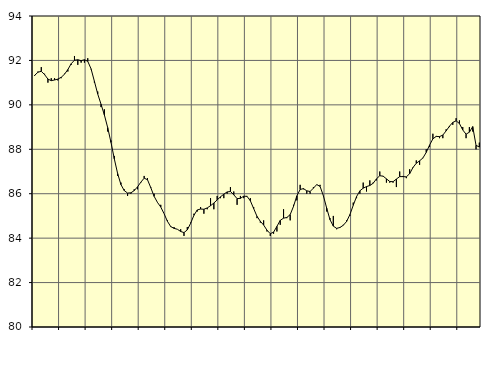
| Category | Piggar | Series 1 |
|---|---|---|
| nan | 91.3 | 91.33 |
| 87.0 | 91.5 | 91.47 |
| 87.0 | 91.7 | 91.51 |
| 87.0 | 91.4 | 91.36 |
| nan | 91 | 91.16 |
| 88.0 | 91.2 | 91.09 |
| 88.0 | 91.2 | 91.12 |
| 88.0 | 91.1 | 91.16 |
| nan | 91.2 | 91.24 |
| 89.0 | 91.4 | 91.38 |
| 89.0 | 91.5 | 91.59 |
| 89.0 | 91.8 | 91.85 |
| nan | 92.2 | 92.01 |
| 90.0 | 91.8 | 92.03 |
| 90.0 | 91.9 | 91.99 |
| 90.0 | 91.9 | 92.03 |
| nan | 92.1 | 91.96 |
| 91.0 | 91.6 | 91.62 |
| 91.0 | 91 | 91.06 |
| 91.0 | 90.6 | 90.49 |
| nan | 89.9 | 90.03 |
| 92.0 | 89.8 | 89.55 |
| 92.0 | 88.8 | 88.98 |
| 92.0 | 88.4 | 88.31 |
| nan | 87.7 | 87.57 |
| 93.0 | 86.8 | 86.91 |
| 93.0 | 86.5 | 86.41 |
| 93.0 | 86.2 | 86.14 |
| nan | 85.9 | 86.03 |
| 94.0 | 86 | 86.04 |
| 94.0 | 86.2 | 86.14 |
| 94.0 | 86.2 | 86.31 |
| nan | 86.5 | 86.52 |
| 95.0 | 86.8 | 86.7 |
| 95.0 | 86.7 | 86.63 |
| 95.0 | 86.3 | 86.27 |
| nan | 86 | 85.88 |
| 96.0 | 85.6 | 85.61 |
| 96.0 | 85.5 | 85.4 |
| 96.0 | 85.1 | 85.1 |
| nan | 84.8 | 84.76 |
| 97.0 | 84.5 | 84.52 |
| 97.0 | 84.5 | 84.44 |
| 97.0 | 84.4 | 84.4 |
| nan | 84.4 | 84.3 |
| 98.0 | 84.1 | 84.25 |
| 98.0 | 84.5 | 84.37 |
| 98.0 | 84.7 | 84.67 |
| nan | 85.1 | 85.03 |
| 99.0 | 85.2 | 85.27 |
| 99.0 | 85.4 | 85.31 |
| 99.0 | 85.1 | 85.3 |
| nan | 85.3 | 85.36 |
| 0.0 | 85.8 | 85.46 |
| 0.0 | 85.3 | 85.58 |
| 0.0 | 85.9 | 85.72 |
| nan | 85.8 | 85.86 |
| 1.0 | 85.8 | 85.98 |
| 1.0 | 86 | 86.08 |
| 1.0 | 86.3 | 86.1 |
| nan | 86.1 | 85.95 |
| 2.0 | 85.5 | 85.78 |
| 2.0 | 85.9 | 85.79 |
| 2.0 | 85.8 | 85.89 |
| nan | 85.9 | 85.88 |
| 3.0 | 85.8 | 85.68 |
| 3.0 | 85.4 | 85.33 |
| 3.0 | 84.9 | 84.98 |
| nan | 84.7 | 84.76 |
| 4.0 | 84.8 | 84.59 |
| 4.0 | 84.3 | 84.36 |
| 4.0 | 84.1 | 84.2 |
| nan | 84.2 | 84.27 |
| 5.0 | 84.3 | 84.53 |
| 5.0 | 84.6 | 84.8 |
| 5.0 | 85.3 | 84.9 |
| nan | 84.9 | 84.93 |
| 6.0 | 84.8 | 85.06 |
| 6.0 | 85.5 | 85.43 |
| 6.0 | 85.7 | 85.9 |
| nan | 86.4 | 86.19 |
| 7.0 | 86.2 | 86.23 |
| 7.0 | 86 | 86.13 |
| 7.0 | 86 | 86.1 |
| nan | 86.3 | 86.25 |
| 8.0 | 86.4 | 86.41 |
| 8.0 | 86.4 | 86.33 |
| 8.0 | 85.9 | 85.91 |
| nan | 85.2 | 85.35 |
| 9.0 | 84.9 | 84.83 |
| 9.0 | 85 | 84.54 |
| 9.0 | 84.4 | 84.44 |
| nan | 84.5 | 84.48 |
| 10.0 | 84.6 | 84.58 |
| 10.0 | 84.8 | 84.75 |
| 10.0 | 85 | 85.06 |
| nan | 85.6 | 85.48 |
| 11.0 | 85.8 | 85.87 |
| 11.0 | 86 | 86.13 |
| 11.0 | 86.5 | 86.25 |
| nan | 86.1 | 86.32 |
| 12.0 | 86.6 | 86.37 |
| 12.0 | 86.5 | 86.47 |
| 12.0 | 86.6 | 86.67 |
| nan | 87 | 86.81 |
| 13.0 | 86.8 | 86.79 |
| 13.0 | 86.5 | 86.67 |
| 13.0 | 86.5 | 86.55 |
| nan | 86.5 | 86.54 |
| 14.0 | 86.3 | 86.66 |
| 14.0 | 87 | 86.77 |
| 14.0 | 86.8 | 86.77 |
| nan | 86.7 | 86.76 |
| 15.0 | 87.1 | 86.9 |
| 15.0 | 87.2 | 87.18 |
| 15.0 | 87.5 | 87.37 |
| nan | 87.3 | 87.48 |
| 16.0 | 87.6 | 87.61 |
| 16.0 | 88 | 87.86 |
| 16.0 | 88.1 | 88.19 |
| nan | 88.7 | 88.47 |
| 17.0 | 88.6 | 88.58 |
| 17.0 | 88.5 | 88.57 |
| 17.0 | 88.5 | 88.64 |
| nan | 88.9 | 88.83 |
| 18.0 | 89 | 89.04 |
| 18.0 | 89.1 | 89.21 |
| 18.0 | 89.4 | 89.28 |
| nan | 89.3 | 89.16 |
| 19.0 | 89 | 88.87 |
| 19.0 | 88.5 | 88.68 |
| 19.0 | 89 | 88.77 |
| nan | 88.8 | 89.02 |
| 20.0 | 88 | 88.18 |
| 20.0 | 88.3 | 88.1 |